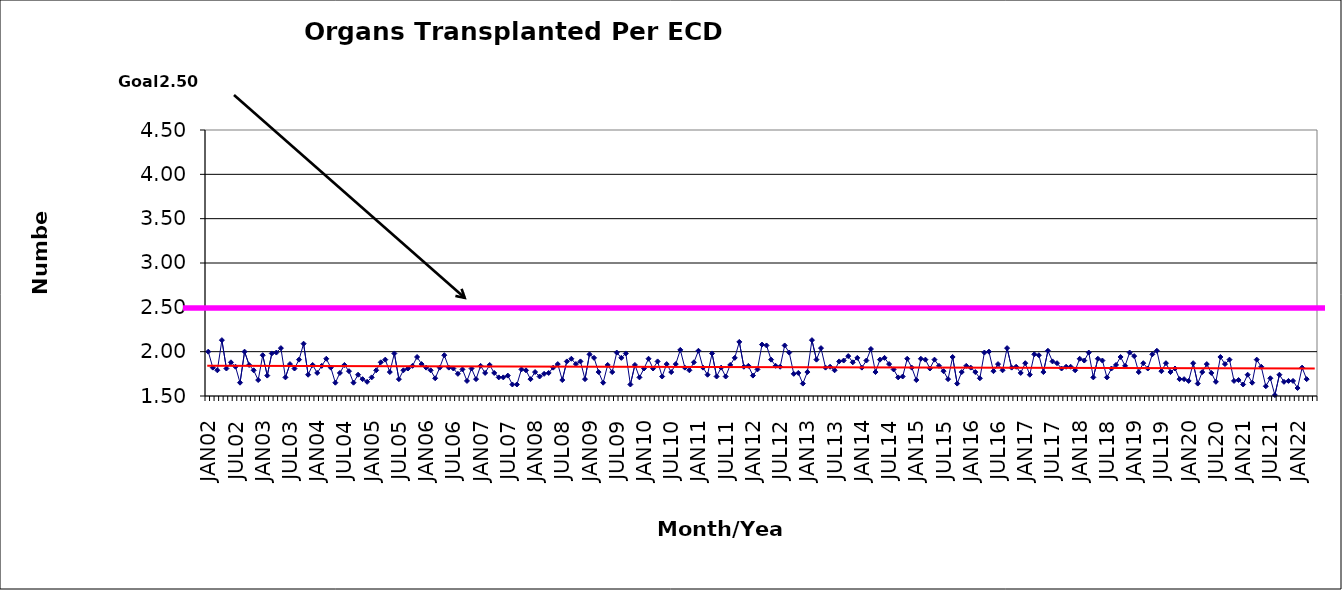
| Category | Series 0 |
|---|---|
| JAN02 | 2 |
| FEB02 | 1.82 |
| MAR02 | 1.79 |
| APR02 | 2.13 |
| MAY02 | 1.81 |
| JUN02 | 1.88 |
| JUL02 | 1.83 |
| AUG02 | 1.65 |
| SEP02 | 2 |
| OCT02 | 1.85 |
| NOV02 | 1.79 |
| DEC02 | 1.68 |
| JAN03 | 1.96 |
| FEB03 | 1.73 |
| MAR03 | 1.98 |
| APR03 | 1.99 |
| MAY03 | 2.04 |
| JUN03 | 1.71 |
| JUL03 | 1.86 |
| AUG03 | 1.81 |
| SEP03 | 1.91 |
| OCT03 | 2.09 |
| NOV03 | 1.74 |
| DEC03 | 1.85 |
| JAN04 | 1.76 |
| FEB04 | 1.84 |
| MAR04 | 1.92 |
| APR04 | 1.82 |
| MAY04 | 1.65 |
| JUN04 | 1.76 |
| JUL04 | 1.85 |
| AUG04 | 1.78 |
| SEP04 | 1.65 |
| OCT04 | 1.74 |
| NOV04 | 1.69 |
| DEC04 | 1.66 |
| JAN05 | 1.71 |
| FEB05 | 1.79 |
| MAR05 | 1.88 |
| APR05 | 1.91 |
| MAY05 | 1.77 |
| JUN05 | 1.98 |
| JUL05 | 1.69 |
| AUG05 | 1.79 |
| SEP05 | 1.81 |
| OCT05 | 1.84 |
| NOV05 | 1.94 |
| DEC05 | 1.86 |
| JAN06 | 1.82 |
| FEB06 | 1.79 |
| MAR06 | 1.7 |
| APR06 | 1.82 |
| MAY06 | 1.96 |
| JUN06 | 1.82 |
| JUL06 | 1.81 |
| AUG06 | 1.75 |
| SEP06 | 1.8 |
| OCT06 | 1.67 |
| NOV06 | 1.81 |
| DEC06 | 1.69 |
| JAN07 | 1.84 |
| FEB07 | 1.76 |
| MAR07 | 1.85 |
| APR07 | 1.76 |
| MAY07 | 1.71 |
| JUN07 | 1.71 |
| JUL07 | 1.73 |
| AUG07 | 1.63 |
| SEP07 | 1.63 |
| OCT07 | 1.8 |
| NOV07 | 1.79 |
| DEC07 | 1.69 |
| JAN08 | 1.77 |
| FEB08 | 1.72 |
| MAR08 | 1.75 |
| APR08 | 1.76 |
| MAY08 | 1.82 |
| JUN08 | 1.86 |
| JUL08 | 1.68 |
| AUG08 | 1.89 |
| SEP08 | 1.92 |
| OCT08 | 1.86 |
| NOV08 | 1.89 |
| DEC08 | 1.69 |
| JAN09 | 1.97 |
| FEB09 | 1.93 |
| MAR09 | 1.77 |
| APR09 | 1.65 |
| MAY09 | 1.85 |
| JUN09 | 1.77 |
| JUL09 | 1.99 |
| AUG09 | 1.93 |
| SEP09 | 1.98 |
| OCT09 | 1.63 |
| NOV09 | 1.85 |
| DEC09 | 1.71 |
| JAN10 | 1.81 |
| FEB10 | 1.92 |
| MAR10 | 1.81 |
| APR10 | 1.89 |
| MAY10 | 1.72 |
| JUN10 | 1.86 |
| JUL10 | 1.77 |
| AUG10 | 1.86 |
| SEP10 | 2.02 |
| OCT10 | 1.82 |
| NOV10 | 1.79 |
| DEC10 | 1.88 |
| JAN11 | 2.01 |
| FEB11 | 1.82 |
| MAR11 | 1.74 |
| APR11 | 1.98 |
| MAY11 | 1.72 |
| JUN11 | 1.82 |
| JUL11 | 1.72 |
| AUG11 | 1.85 |
| SEP11 | 1.93 |
| OCT11 | 2.11 |
| NOV11 | 1.83 |
| DEC11 | 1.84 |
| JAN12 | 1.73 |
| FEB12 | 1.8 |
| MAR12 | 2.08 |
| APR12 | 2.07 |
| MAY12 | 1.91 |
| JUN12 | 1.84 |
| JUL12 | 1.83 |
| AUG12 | 2.07 |
| SEP12 | 1.99 |
| OCT12 | 1.75 |
| NOV12 | 1.76 |
| DEC12 | 1.64 |
| JAN13 | 1.77 |
| FEB13 | 2.13 |
| MAR13 | 1.91 |
| APR13 | 2.04 |
| MAY13 | 1.82 |
| JUN13 | 1.83 |
| JUL13 | 1.79 |
| AUG13 | 1.89 |
| SEP13 | 1.9 |
| OCT13 | 1.95 |
| NOV13 | 1.88 |
| DEC13 | 1.93 |
| JAN14 | 1.82 |
| FEB14 | 1.9 |
| MAR14 | 2.03 |
| APR14 | 1.77 |
| MAY14 | 1.91 |
| JUN14 | 1.93 |
| JUL14 | 1.86 |
| AUG14 | 1.8 |
| SEP14 | 1.71 |
| OCT14 | 1.72 |
| NOV14 | 1.92 |
| DEC14 | 1.82 |
| JAN15 | 1.68 |
| FEB15 | 1.92 |
| MAR15 | 1.91 |
| APR15 | 1.81 |
| MAY15 | 1.91 |
| JUN15 | 1.84 |
| JUL15 | 1.78 |
| AUG15 | 1.69 |
| SEP15 | 1.94 |
| OCT15 | 1.64 |
| NOV15 | 1.77 |
| DEC15 | 1.84 |
| JAN16 | 1.82 |
| FEB16 | 1.77 |
| MAR16 | 1.7 |
| APR16 | 1.99 |
| MAY16 | 2 |
| JUN16 | 1.78 |
| JUL16 | 1.86 |
| AUG16 | 1.79 |
| SEP16 | 2.04 |
| OCT16 | 1.82 |
| NOV16 | 1.83 |
| DEC16 | 1.76 |
| JAN17 | 1.87 |
| FEB17 | 1.74 |
| MAR17 | 1.97 |
| APR17 | 1.96 |
| MAY17 | 1.77 |
| JUN17 | 2.01 |
| JUL17 | 1.89 |
| AUG17 | 1.87 |
| SEP17 | 1.81 |
| OCT17 | 1.83 |
| NOV17 | 1.83 |
| DEC17 | 1.79 |
| JAN18 | 1.92 |
| FEB18 | 1.9 |
| MAR18 | 1.99 |
| APR18 | 1.71 |
| MAY18 | 1.92 |
| JUN18 | 1.9 |
| JUL18 | 1.71 |
| AUG18 | 1.81 |
| SEP18 | 1.85 |
| OCT18 | 1.94 |
| NOV18 | 1.84 |
| DEC18 | 1.99 |
| JAN19 | 1.95 |
| FEB19 | 1.77 |
| MAR19 | 1.87 |
| APR19 | 1.81 |
| MAY19 | 1.97 |
| JUN19 | 2.01 |
| JUL19 | 1.78 |
| AUG19 | 1.87 |
| SEP19 | 1.77 |
| OCT19 | 1.81 |
| NOV19 | 1.69 |
| DEC19 | 1.69 |
| JAN20 | 1.67 |
| FEB20 | 1.87 |
| MAR20 | 1.64 |
| APR20 | 1.77 |
| MAY20 | 1.86 |
| JUN20 | 1.76 |
| JUL20 | 1.66 |
| AUG20 | 1.94 |
| SEP20 | 1.86 |
| OCT20 | 1.91 |
| NOV20 | 1.67 |
| DEC20 | 1.68 |
| JAN21 | 1.63 |
| FEB21 | 1.74 |
| MAR21 | 1.65 |
| APR21 | 1.91 |
| MAY21 | 1.83 |
| JUN21 | 1.61 |
| JUL21 | 1.7 |
| AUG21 | 1.51 |
| SEP21 | 1.74 |
| OCT21 | 1.66 |
| NOV21 | 1.67 |
| DEC21 | 1.67 |
| JAN22 | 1.59 |
| FEB22 | 1.82 |
| MAR22 | 1.69 |